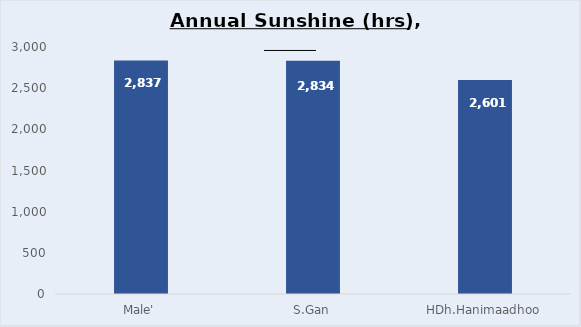
| Category | Series 0 |
|---|---|
| Male' | 2837.1 |
| S.Gan | 2834.4 |
| HDh.Hanimaadhoo | 2600.6 |